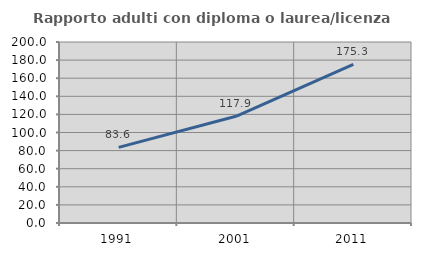
| Category | Rapporto adulti con diploma o laurea/licenza media  |
|---|---|
| 1991.0 | 83.607 |
| 2001.0 | 117.925 |
| 2011.0 | 175.291 |